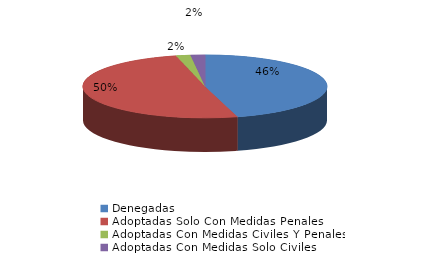
| Category | Series 0 |
|---|---|
| Denegadas | 48 |
| Adoptadas Solo Con Medidas Penales | 53 |
| Adoptadas Con Medidas Civiles Y Penales | 2 |
| Adoptadas Con Medidas Solo Civiles | 2 |